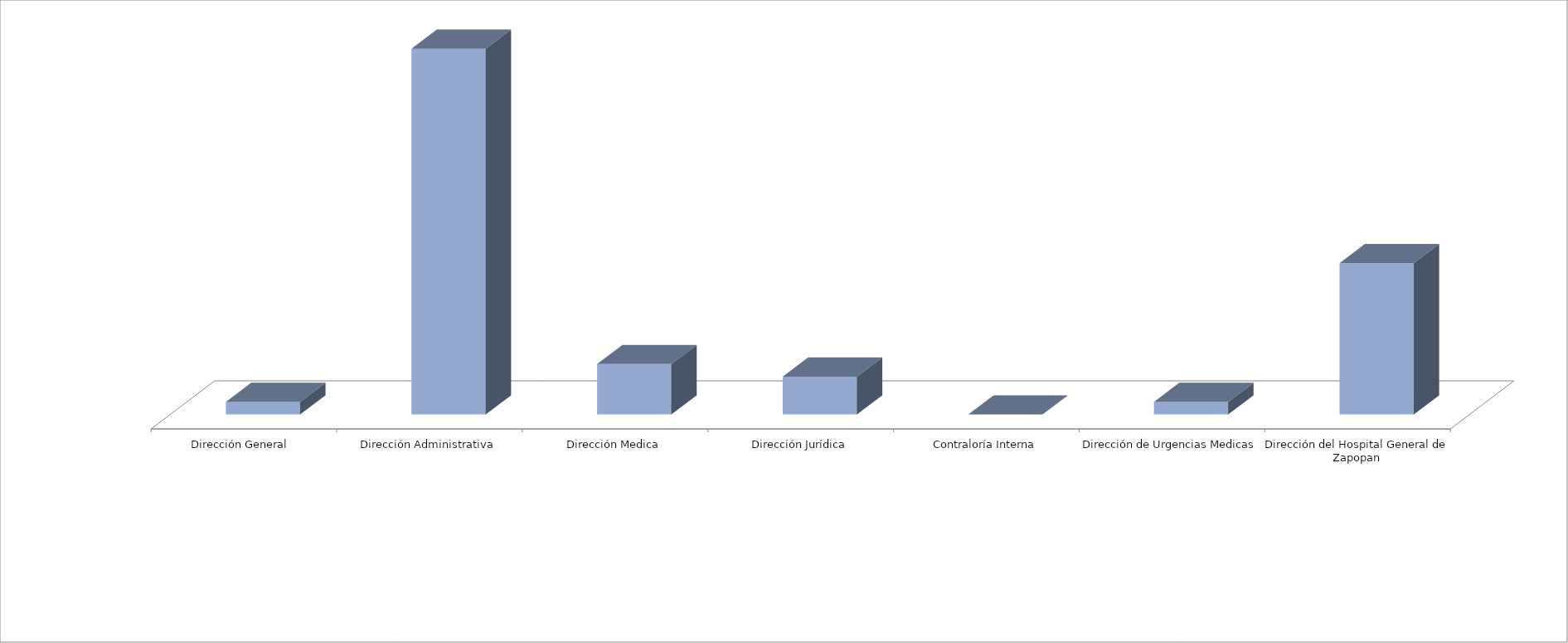
| Category | Series 0 | Series 1 |
|---|---|---|
| Dirección General  |  | 1 |
| Dirección Administrativa |  | 29 |
| Dirección Medica |  | 4 |
| Dirección Jurídica |  | 3 |
| Contraloría Interna |  | 0 |
| Dirección de Urgencias Medicas |  | 1 |
| Dirección del Hospital General de Zapopan |  | 12 |